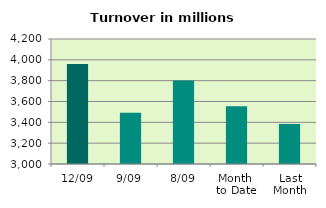
| Category | Series 0 |
|---|---|
| 12/09 | 3960.087 |
| 9/09 | 3490.858 |
| 8/09 | 3801.74 |
| Month 
to Date | 3553.479 |
| Last
Month | 3384.596 |